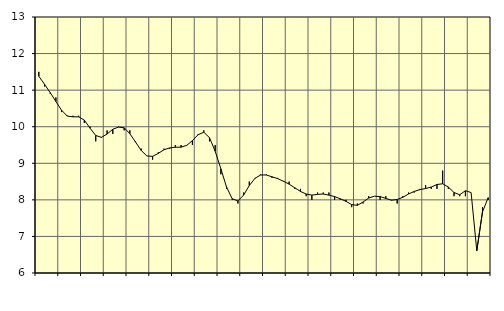
| Category | Piggar | Tillverkning av verkstadsvaror, SNI 25-30, 33 |
|---|---|---|
| nan | 11.5 | 11.38 |
| 1.0 | 11.1 | 11.16 |
| 1.0 | 10.9 | 10.93 |
| 1.0 | 10.8 | 10.69 |
| nan | 10.4 | 10.45 |
| 2.0 | 10.3 | 10.29 |
| 2.0 | 10.3 | 10.27 |
| 2.0 | 10.3 | 10.27 |
| nan | 10.1 | 10.18 |
| 3.0 | 10 | 9.96 |
| 3.0 | 9.6 | 9.76 |
| 3.0 | 9.7 | 9.71 |
| nan | 9.9 | 9.8 |
| 4.0 | 9.8 | 9.93 |
| 4.0 | 10 | 9.99 |
| 4.0 | 9.9 | 9.97 |
| nan | 9.9 | 9.81 |
| 5.0 | 9.6 | 9.58 |
| 5.0 | 9.4 | 9.35 |
| 5.0 | 9.2 | 9.2 |
| nan | 9.1 | 9.19 |
| 6.0 | 9.3 | 9.27 |
| 6.0 | 9.4 | 9.37 |
| 6.0 | 9.4 | 9.42 |
| nan | 9.5 | 9.44 |
| 7.0 | 9.5 | 9.44 |
| 7.0 | 9.5 | 9.49 |
| 7.0 | 9.5 | 9.62 |
| nan | 9.8 | 9.78 |
| 8.0 | 9.9 | 9.85 |
| 8.0 | 9.6 | 9.7 |
| 8.0 | 9.5 | 9.33 |
| nan | 8.7 | 8.85 |
| 9.0 | 8.3 | 8.35 |
| 9.0 | 8 | 8.03 |
| 9.0 | 7.9 | 7.97 |
| nan | 8.2 | 8.13 |
| 10.0 | 8.5 | 8.39 |
| 10.0 | 8.6 | 8.59 |
| 10.0 | 8.7 | 8.68 |
| nan | 8.7 | 8.68 |
| 11.0 | 8.6 | 8.63 |
| 11.0 | 8.6 | 8.58 |
| 11.0 | 8.5 | 8.51 |
| nan | 8.5 | 8.43 |
| 12.0 | 8.3 | 8.33 |
| 12.0 | 8.3 | 8.23 |
| 12.0 | 8.1 | 8.16 |
| nan | 8 | 8.13 |
| 13.0 | 8.2 | 8.15 |
| 13.0 | 8.2 | 8.16 |
| 13.0 | 8.2 | 8.13 |
| nan | 8 | 8.09 |
| 14.0 | 8 | 8.03 |
| 14.0 | 8 | 7.96 |
| 14.0 | 7.8 | 7.87 |
| nan | 7.9 | 7.85 |
| 15.0 | 7.9 | 7.94 |
| 15.0 | 8.1 | 8.05 |
| 15.0 | 8.1 | 8.1 |
| nan | 8 | 8.09 |
| 16.0 | 8.1 | 8.04 |
| 16.0 | 8 | 7.99 |
| 16.0 | 7.9 | 8.01 |
| nan | 8.1 | 8.07 |
| 17.0 | 8.2 | 8.16 |
| 17.0 | 8.2 | 8.23 |
| 17.0 | 8.3 | 8.28 |
| nan | 8.4 | 8.31 |
| 18.0 | 8.3 | 8.35 |
| 18.0 | 8.3 | 8.42 |
| 18.0 | 8.8 | 8.44 |
| nan | 8.3 | 8.35 |
| 19.0 | 8.1 | 8.2 |
| 19.0 | 8.1 | 8.14 |
| 19.0 | 8.1 | 8.25 |
| nan | 8.2 | 8.2 |
| 20.0 | 6.6 | 6.61 |
| 20.0 | 7.8 | 7.67 |
| 20.0 | 8 | 8.06 |